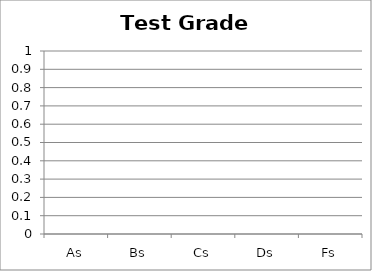
| Category | Distribution of Grades |
|---|---|
| As | 0 |
| Bs | 0 |
| Cs | 0 |
| Ds | 0 |
| Fs | 0 |